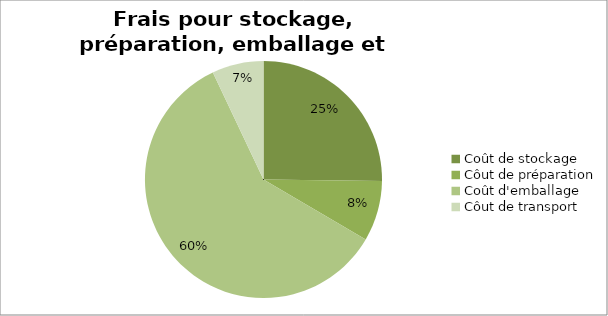
| Category | Series 0 |
|---|---|
| Coût de stockage | 0.138 |
| Côut de préparation | 0.045 |
| Coût d'emballage | 0.325 |
| Côut de transport | 0.038 |